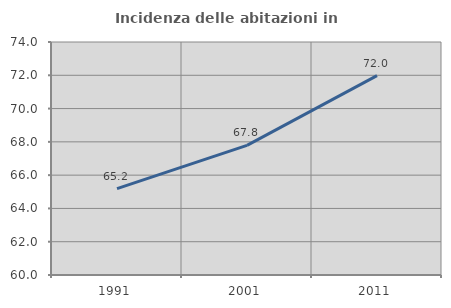
| Category | Incidenza delle abitazioni in proprietà  |
|---|---|
| 1991.0 | 65.194 |
| 2001.0 | 67.785 |
| 2011.0 | 71.98 |